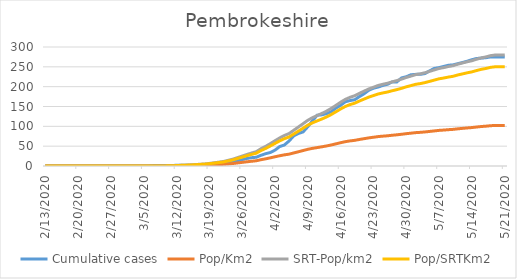
| Category | Cumulative cases | Pop/Km2 | SRT-Pop/km2 | Pop/SRTKm2 |
|---|---|---|---|---|
| 5/21/20 | 275 | 102.188 | 279.841 | 250.211 |
| 5/20/20 | 275 | 102.188 | 279.841 | 250.211 |
| 5/19/20 | 275 | 102.164 | 279.775 | 250.153 |
| 5/18/20 | 275 | 101.604 | 278.242 | 248.781 |
| 5/17/20 | 273 | 100.412 | 274.977 | 245.862 |
| 5/16/20 | 272 | 99.524 | 272.544 | 243.687 |
| 5/15/20 | 271 | 98.276 | 269.126 | 240.631 |
| 5/14/20 | 268 | 96.891 | 265.335 | 237.241 |
| 5/13/20 | 264 | 95.931 | 262.706 | 234.89 |
| 5/12/20 | 261 | 94.827 | 259.682 | 232.187 |
| 5/11/20 | 258 | 93.731 | 256.68 | 229.502 |
| 5/10/20 | 255 | 92.37 | 252.955 | 226.172 |
| 5/9/20 | 254 | 91.578 | 250.786 | 224.232 |
| 5/8/20 | 251 | 90.586 | 248.068 | 221.803 |
| 5/7/20 | 248 | 89.786 | 245.877 | 219.843 |
| 5/6/20 | 246 | 88.466 | 242.262 | 216.611 |
| 5/5/20 | 240 | 87.145 | 238.646 | 213.378 |
| 5/4/20 | 233 | 85.873 | 235.162 | 210.263 |
| 5/3/20 | 231 | 84.849 | 232.357 | 207.755 |
| 5/2/20 | 231 | 84.097 | 230.298 | 205.913 |
| 5/1/20 | 230 | 82.761 | 226.638 | 202.642 |
| 4/30/20 | 225 | 81.496 | 223.176 | 199.546 |
| 4/29/20 | 222 | 79.96 | 218.969 | 195.784 |
| 4/28/20 | 212 | 78.656 | 215.397 | 192.591 |
| 4/27/20 | 212 | 77.487 | 212.198 | 189.73 |
| 4/26/20 | 206 | 76.175 | 208.604 | 186.517 |
| 4/25/20 | 203 | 75.223 | 205.997 | 184.186 |
| 4/24/20 | 199 | 74.143 | 203.039 | 181.541 |
| 4/23/20 | 196 | 72.486 | 198.503 | 177.485 |
| 4/22/20 | 191 | 70.902 | 194.164 | 173.606 |
| 4/21/20 | 182 | 68.894 | 188.664 | 168.688 |
| 4/20/20 | 175 | 66.869 | 183.121 | 163.732 |
| 4/19/20 | 167 | 64.669 | 177.095 | 158.344 |
| 4/18/20 | 165 | 63.245 | 173.194 | 154.856 |
| 4/17/20 | 162 | 61.3 | 167.87 | 150.095 |
| 4/16/20 | 153 | 58.724 | 160.814 | 143.787 |
| 4/15/20 | 146 | 55.851 | 152.947 | 136.753 |
| 4/14/20 | 137 | 53.011 | 145.169 | 129.798 |
| 4/13/20 | 132 | 50.53 | 138.376 | 123.724 |
| 4/12/20 | 129 | 48.394 | 132.525 | 118.493 |
| 4/11/20 | 128 | 46.449 | 127.201 | 113.732 |
| 4/10/20 | 114 | 44.497 | 121.854 | 108.952 |
| 4/9/20 | 99 | 42.096 | 115.28 | 103.074 |
| 4/8/20 | 86 | 38.976 | 106.734 | 95.433 |
| 4/7/20 | 82 | 35.911 | 98.342 | 87.93 |
| 4/6/20 | 76 | 32.903 | 90.103 | 80.563 |
| 4/5/20 | 63 | 29.87 | 81.798 | 73.137 |
| 4/4/20 | 53 | 28.102 | 76.956 | 68.808 |
| 4/3/20 | 49 | 25.853 | 70.798 | 63.302 |
| 4/2/20 | 40 | 23.261 | 63.699 | 56.954 |
| 4/1/20 | 34 | 20.596 | 56.402 | 50.43 |
| 3/31/20 | 31 | 18.036 | 49.39 | 44.161 |
| 3/30/20 | 27 | 15.867 | 43.452 | 38.851 |
| 3/29/20 | 22 | 13.195 | 36.133 | 32.307 |
| 3/28/20 | 21 | 11.946 | 32.715 | 29.251 |
| 3/27/20 | 19 | 10.618 | 29.078 | 25.999 |
| 3/26/20 | 16 | 9.138 | 25.024 | 22.374 |
| 3/25/20 | 13 | 7.746 | 21.211 | 18.965 |
| 3/24/20 | 9 | 6.281 | 17.201 | 15.38 |
| 3/23/20 | 9 | 5.201 | 14.243 | 12.735 |
| 3/22/20 | 6 | 4.161 | 11.394 | 10.188 |
| 3/21/20 | 4 | 3.553 | 9.729 | 8.699 |
| 3/20/20 | 2 | 2.953 | 8.086 | 7.23 |
| 3/19/20 | 2 | 2.376 | 6.508 | 5.819 |
| 3/18/20 | 2 | 1.896 | 5.193 | 4.643 |
| 3/17/20 | 2 | 1.616 | 4.426 | 3.958 |
| 3/16/20 | 2 | 1.32 | 3.616 | 3.233 |
| 3/15/20 | 2 | 1.048 | 2.871 | 2.567 |
| 3/14/20 | 2 | 0.816 | 2.235 | 1.998 |
| 3/13/20 | 2 | 0.664 | 1.819 | 1.626 |
| 3/12/20 | 2 | 0.448 | 1.227 | 1.097 |
| 3/11/20 | 1 | 0.256 | 0.701 | 0.627 |
| 3/10/20 | 1 | 0.144 | 0.394 | 0.353 |
| 3/9/20 | 1 | 0.056 | 0.153 | 0.137 |
| 3/8/20 | 1 | 0.032 | 0.088 | 0.078 |
| 3/7/20 | 1 | 0.032 | 0.088 | 0.078 |
| 3/6/20 | 0 | 0.016 | 0.044 | 0.039 |
| 3/5/20 | 0 | 0.016 | 0.044 | 0.039 |
| 3/4/20 | 0 | 0.016 | 0.044 | 0.039 |
| 3/3/20 | 0 | 0.008 | 0.022 | 0.02 |
| 3/2/20 | 0 | 0.008 | 0.022 | 0.02 |
| 3/1/20 | 0 | 0.008 | 0.022 | 0.02 |
| 2/29/20 | 0 | 0.008 | 0.022 | 0.02 |
| 2/28/20 | 0 | 0.008 | 0.022 | 0.02 |
| 2/27/20 | 0 | 0.008 | 0.022 | 0.02 |
| 2/26/20 | 0 | 0 | 0 | 0 |
| 2/25/20 | 0 | 0 | 0 | 0 |
| 2/24/20 | 0 | 0 | 0 | 0 |
| 2/23/20 | 0 | 0 | 0 | 0 |
| 2/22/20 | 0 | 0 | 0 | 0 |
| 2/21/20 | 0 | 0 | 0 | 0 |
| 2/20/20 | 0 | 0 | 0 | 0 |
| 2/19/20 | 0 | 0 | 0 | 0 |
| 2/18/20 | 0 | 0 | 0 | 0 |
| 2/17/20 | 0 | 0 | 0 | 0 |
| 2/16/20 | 0 | 0 | 0 | 0 |
| 2/15/20 | 0 | 0 | 0 | 0 |
| 2/14/20 | 0 | 0 | 0 | 0 |
| 2/13/20 | 0 | 0 | 0 | 0 |